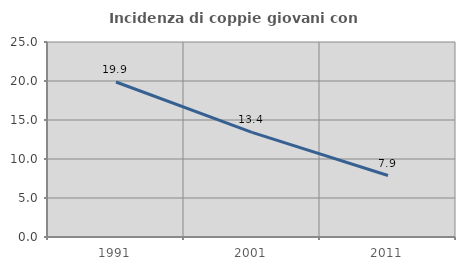
| Category | Incidenza di coppie giovani con figli |
|---|---|
| 1991.0 | 19.872 |
| 2001.0 | 13.405 |
| 2011.0 | 7.883 |